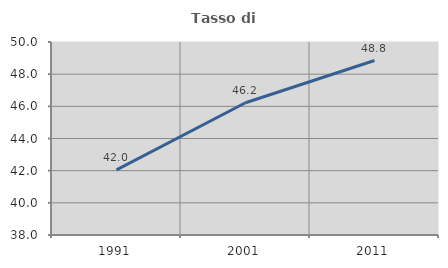
| Category | Tasso di occupazione   |
|---|---|
| 1991.0 | 42.048 |
| 2001.0 | 46.22 |
| 2011.0 | 48.847 |